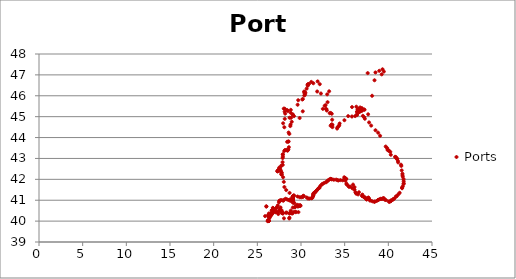
| Category | Ports |
|---|---|
| 26.031697 | 40.707 |
| 26.034148 | 40.698 |
| 26.775883 | 40.635 |
| 26.812547 | 40.62 |
| 26.826738 | 40.585 |
| 26.753546 | 40.552 |
| 26.687336 | 40.511 |
| 26.637445 | 40.509 |
| 26.328235 | 40.368 |
| 26.235822 | 40.294 |
| 25.889695 | 40.239 |
| 26.272296 | 40.213 |
| 26.211569 | 40.049 |
| 26.381764 | 40.152 |
| 26.365305 | 40.182 |
| 26.36253 | 40.2 |
| 26.430652 | 40.227 |
| 26.599782 | 40.327 |
| 26.632606 | 40.36 |
| 26.645759 | 40.399 |
| 26.688386 | 40.411 |
| 26.777734 | 40.48 |
| 26.901169 | 40.533 |
| 27.110716 | 40.604 |
| 27.18777 | 40.634 |
| 27.250049 | 40.666 |
| 27.338415 | 40.75 |
| 27.474058 | 40.902 |
| 27.518727 | 40.966 |
| 27.562311 | 40.978 |
| 27.640044 | 40.99 |
| 27.739357 | 41.008 |
| 27.970143 | 40.974 |
| 28.000019 | 41.016 |
| 28.230348 | 41.071 |
| 28.412015 | 41.039 |
| 28.579633 | 41.008 |
| 28.766643 | 40.975 |
| 28.736202 | 41.034 |
| 28.885613 | 40.974 |
| 28.9079133 | 40.983 |
| 28.958939 | 40.989 |
| 28.951804 | 41.006 |
| 28.964694 | 41.001 |
| 28.971333 | 41.001 |
| 28.974338 | 41 |
| 28.97943 | 41.018 |
| 28.974672 | 41.018 |
| 28.989457 | 41.027 |
| 28.999186 | 41.035 |
| 29.012492 | 41.04 |
| 29.023046 | 41.044 |
| 29.0259 | 41.046 |
| 29.037353 | 41.055 |
| 29.044552 | 41.064 |
| 29.045854 | 41.077 |
| 29.058124 | 41.087 |
| 29.056327 | 41.098 |
| 29.059717 | 41.111 |
| 29.060607 | 41.112 |
| 29.072046 | 41.121 |
| 29.066613 | 41.132 |
| 29.057643 | 41.138 |
| 29.038087 | 41.157 |
| 29.077336 | 41.183 |
| 29.081309 | 41.187 |
| 29.089103 | 41.195 |
| 29.100896 | 41.205 |
| 29.111432 | 41.213 |
| 28.692336 | 41.348 |
| 28.307975 | 41.487 |
| 28.0986 | 41.632 |
| 28.030661 | 41.878 |
| 27.951729 | 42.099 |
| 27.777205 | 42.225 |
| 27.780019 | 42.233 |
| 27.755799 | 42.263 |
| 27.792529 | 42.322 |
| 27.754538 | 42.328 |
| 27.692383 | 42.424 |
| 27.573028 | 42.449 |
| 27.533746 | 42.449 |
| 27.449732 | 42.415 |
| 27.322793 | 42.382 |
| 27.282161 | 42.388 |
| 27.335246 | 42.422 |
| 27.449466 | 42.474 |
| 27.493903 | 42.556 |
| 27.621543 | 42.554 |
| 27.735477 | 42.653 |
| 27.904284 | 42.689 |
| 27.890664 | 42.822 |
| 27.898019 | 43.019 |
| 27.925967 | 43.086 |
| 27.91971 | 43.178 |
| 27.920788 | 43.204 |
| 28.084006 | 43.354 |
| 28.164406 | 43.404 |
| 28.344595 | 43.406 |
| 28.45283 | 43.37 |
| 28.517872 | 43.413 |
| 28.550458 | 43.438 |
| 28.610005 | 43.538 |
| 28.535589 | 43.804 |
| 28.410275 | 43.797 |
| 28.583472 | 43.812 |
| 28.582393 | 44.24 |
| 28.09031 | 44.494 |
| 27.952134 | 44.682 |
| 28.139512 | 44.895 |
| 28.662766 | 44.172 |
| 28.775075 | 44.549 |
| 28.802835 | 44.623 |
| 28.941423 | 44.756 |
| 28.687121 | 44.948 |
| 28.861707 | 44.948 |
| 28.8148 | 45.186 |
| 28.491626 | 45.27 |
| 28.138792 | 45.379 |
| 28.025101 | 45.385 |
| 28.127894 | 45.239 |
| 28.186283 | 45.145 |
| 29.198041 | 45.025 |
| 29.0675 | 45.101 |
| 29.048 | 45.103 |
| 29.844811 | 44.935 |
| 28.831523 | 45.326 |
| 28.411852 | 45.32 |
| 30.203218 | 45.255 |
| 29.612769 | 45.57 |
| 29.682246 | 45.788 |
| 30.156114 | 45.822 |
| 30.201405 | 45.843 |
| 30.375449 | 46.013 |
| 30.467095 | 46.06 |
| 30.390811 | 46.138 |
| 30.348578 | 46.201 |
| 30.43704 | 46.184 |
| 30.501262 | 46.141 |
| 30.644508 | 46.341 |
| 30.769154 | 46.48 |
| 30.75644 | 46.538 |
| 30.802134 | 46.552 |
| 30.913587 | 46.567 |
| 31.179551 | 46.664 |
| 31.412078 | 46.599 |
| 31.904405 | 46.689 |
| 32.147822 | 46.556 |
| 31.852853 | 46.205 |
| 32.282864 | 46.108 |
| 32.997453 | 46.068 |
| 33.222635 | 46.213 |
| 33.042744 | 45.695 |
| 32.813667 | 45.553 |
| 32.714032 | 45.518 |
| 32.499556 | 45.372 |
| 32.863964 | 45.367 |
| 32.905978 | 45.362 |
| 32.957691 | 45.294 |
| 33.290377 | 45.164 |
| 33.388426 | 45.18 |
| 33.519253 | 45.139 |
| 33.567574 | 44.854 |
| 33.596857 | 44.61 |
| 33.531048 | 44.613 |
| 33.51877 | 44.622 |
| 33.487901 | 44.61 |
| 33.396512 | 44.563 |
| 33.598965 | 44.498 |
| 34.133977 | 44.431 |
| 34.175483 | 44.487 |
| 34.310787 | 44.544 |
| 34.37513 | 44.589 |
| 34.424744 | 44.674 |
| 34.971394 | 44.831 |
| 35.40311 | 45.027 |
| 35.832027 | 45.008 |
| 36.202315 | 45.028 |
| 36.428808 | 45.079 |
| 36.427795 | 45.133 |
| 36.417346 | 45.237 |
| 36.417027 | 45.238 |
| 36.48147 | 45.346 |
| 36.518247 | 45.349 |
| 36.619878 | 45.369 |
| 36.628 | 45.373 |
| 36.337184 | 45.477 |
| 35.843472 | 45.459 |
| 37.637411 | 47.087 |
| 38.526526 | 47.118 |
| 38.961722 | 47.195 |
| 39.335434 | 47.268 |
| 39.491058 | 47.16 |
| 39.239728 | 47.026 |
| 38.417705 | 46.743 |
| 38.139734 | 46 |
| 37.2783 | 45.334 |
| 37.211466 | 45.338 |
| 36.970666 | 45.408 |
| 36.769743 | 45.439 |
| 36.764766 | 45.357 |
| 36.85376 | 45.313 |
| 36.982623 | 45.295 |
| 36.945466 | 45.28 |
| 36.719189 | 45.227 |
| 36.614144 | 45.214 |
| 37.085413 | 45.04 |
| 37.239085 | 44.97 |
| 37.309645 | 44.901 |
| 37.687782 | 45.112 |
| 37.793801 | 44.723 |
| 38.034439 | 44.572 |
| 38.529342 | 44.349 |
| 38.830548 | 44.233 |
| 39.057199 | 44.086 |
| 39.699182 | 43.57 |
| 39.862905 | 43.501 |
| 39.907325 | 43.412 |
| 40.009349 | 43.38 |
| 40.081753 | 43.37 |
| 40.223249 | 43.315 |
| 40.283551 | 43.177 |
| 40.767469 | 43.078 |
| 40.860819 | 43.068 |
| 40.946654 | 42.996 |
| 41.01976 | 42.987 |
| 41.093344 | 42.885 |
| 41.121505 | 42.812 |
| 41.455723 | 42.698 |
| 41.484241 | 42.641 |
| 41.530916 | 42.427 |
| 41.617157 | 42.27 |
| 41.62486 | 42.196 |
| 41.653621 | 42.129 |
| 41.74261 | 42.011 |
| 41.75631 | 41.909 |
| 41.764068 | 41.811 |
| 41.74619 | 41.773 |
| 41.650231 | 41.656 |
| 41.565274 | 41.605 |
| 41.573741 | 41.573 |
| 41.294959 | 41.354 |
| 41.148443 | 41.283 |
| 40.971727 | 41.195 |
| 40.872667 | 41.185 |
| 40.709049 | 41.089 |
| 40.569334 | 41.049 |
| 40.534456 | 41.036 |
| 40.323847 | 40.991 |
| 40.305805 | 40.973 |
| 40.259139 | 40.948 |
| 40.112901 | 40.918 |
| 40.068253 | 40.942 |
| 39.739089 | 41.005 |
| 39.596558 | 41.022 |
| 39.509828 | 41.079 |
| 39.435566 | 41.105 |
| 39.336734 | 41.071 |
| 39.226905 | 41.061 |
| 39.135874 | 41.069 |
| 38.992223 | 41.045 |
| 38.846198 | 41.014 |
| 38.821436 | 41.008 |
| 38.654644 | 40.963 |
| 38.43706 | 40.929 |
| 38.390134 | 40.927 |
| 38.174747 | 40.947 |
| 37.932806 | 40.99 |
| 37.884258 | 40.991 |
| 37.789688 | 41.073 |
| 37.728723 | 41.117 |
| 37.701261 | 41.122 |
| 37.516071 | 41.031 |
| 37.48725 | 41.053 |
| 37.387574 | 41.109 |
| 37.332904 | 41.12 |
| 37.29641 | 41.137 |
| 37.228018 | 41.15 |
| 37.037293 | 41.189 |
| 36.976401 | 41.217 |
| 37.03072 | 41.27 |
| 36.636986 | 41.381 |
| 36.542199 | 41.28 |
| 36.339631 | 41.315 |
| 36.317182 | 41.329 |
| 36.228463 | 41.38 |
| 36.131482 | 41.502 |
| 36.122683 | 41.629 |
| 35.959063 | 41.748 |
| 35.882748 | 41.57 |
| 35.659999 | 41.648 |
| 35.501672 | 41.639 |
| 35.415002 | 41.687 |
| 35.238398 | 41.753 |
| 35.201452 | 41.792 |
| 35.090278 | 41.929 |
| 35.14885 | 42.021 |
| 35.178924 | 42.026 |
| 35.074574 | 42.032 |
| 35.05828 | 42.05 |
| 35.04221 | 42.06 |
| 34.955292 | 42.098 |
| 34.772607 | 41.953 |
| 34.510945 | 41.962 |
| 34.279437 | 41.945 |
| 34.167921 | 41.964 |
| 34.032162 | 41.985 |
| 33.758788 | 41.981 |
| 33.530921 | 42 |
| 33.466118 | 42.01 |
| 33.396323 | 42.017 |
| 33.362693 | 42.021 |
| 33.203928 | 41.978 |
| 33.074305 | 41.941 |
| 32.984664 | 41.901 |
| 32.858033 | 41.859 |
| 32.66982 | 41.831 |
| 32.481548 | 41.784 |
| 32.386015 | 41.755 |
| 32.215629 | 41.687 |
| 32.127892 | 41.601 |
| 32.045434 | 41.584 |
| 32.0247 | 41.572 |
| 31.95374 | 41.538 |
| 31.827473 | 41.489 |
| 31.78667 | 41.459 |
| 31.68226 | 41.412 |
| 31.604219 | 41.379 |
| 31.588112 | 41.375 |
| 31.542509 | 41.365 |
| 31.464391 | 41.331 |
| 31.417137 | 41.317 |
| 31.406567 | 41.285 |
| 31.391451 | 41.245 |
| 31.406413 | 41.217 |
| 31.375819 | 41.182 |
| 31.300354 | 41.119 |
| 31.23376 | 41.103 |
| 31.199289 | 41.098 |
| 30.967863 | 41.079 |
| 30.80211 | 41.086 |
| 30.649346 | 41.131 |
| 30.320853 | 41.199 |
| 30.260447 | 41.214 |
| 30.224412 | 41.17 |
| 30.194158 | 41.156 |
| 30.019743 | 41.141 |
| 29.847963 | 41.144 |
| 29.60646 | 41.178 |
| 29.210147 | 41.227 |
| 29.157334 | 41.22 |
| 29.119694 | 41.202 |
| 29.111677 | 41.185 |
| 29.08635 | 41.175 |
| 29.072073 | 41.164 |
| 29.075837 | 41.153 |
| 29.076805 | 41.138 |
| 29.08705 | 41.135 |
| 29.095077 | 41.124 |
| 29.080276 | 41.109 |
| 29.065214 | 41.094 |
| 29.06502 | 41.087 |
| 29.065026 | 41.082 |
| 29.063017 | 41.078 |
| 29.058339 | 41.075 |
| 29.055235 | 41.068 |
| 29.051703 | 41.058 |
| 29.051118 | 41.049 |
| 29.013073 | 41.03 |
| 29.019416 | 40.993 |
| 29.032451 | 40.977 |
| 29.037228 | 40.966 |
| 29.066719 | 40.959 |
| 29.090085 | 40.948 |
| 29.072914 | 40.882 |
| 29.141067 | 40.896 |
| 29.233356 | 40.867 |
| 29.496275 | 40.765 |
| 29.616011 | 40.777 |
| 29.790969 | 40.74 |
| 29.878164 | 40.753 |
| 29.922895 | 40.755 |
| 29.929593 | 40.727 |
| 29.817078 | 40.731 |
| 29.715614 | 40.715 |
| 29.628146 | 40.699 |
| 29.516502 | 40.716 |
| 29.334511 | 40.677 |
| 29.277631 | 40.666 |
| 29.064442 | 40.65 |
| 28.829686 | 40.503 |
| 29.144694 | 40.43 |
| 29.344186 | 40.452 |
| 29.702657 | 40.43 |
| 29.413277 | 40.427 |
| 29.022281 | 40.364 |
| 28.893219 | 40.373 |
| 28.799347 | 40.394 |
| 28.724505 | 40.379 |
| 28.668347 | 40.368 |
| 28.675363 | 40.164 |
| 28.649587 | 40.128 |
| 28.375894 | 40.404 |
| 28.2742 | 40.403 |
| 28.050389 | 40.132 |
| 27.93492 | 40.366 |
| 27.893588 | 40.383 |
| 27.874753 | 40.376 |
| 27.788782 | 40.395 |
| 27.784669 | 40.514 |
| 27.920051 | 40.406 |
| 27.603401 | 40.487 |
| 27.506947 | 40.501 |
| 27.557503 | 40.582 |
| 27.659173 | 40.653 |
| 27.404111 | 40.339 |
| 27.318165 | 40.413 |
| 27.20419 | 40.436 |
| 27.149023 | 40.455 |
| 27.063578 | 40.422 |
| 26.779828 | 40.408 |
| 26.719849 | 40.385 |
| 26.686202 | 40.353 |
| 26.587016 | 40.276 |
| 26.405553 | 40.191 |
| 26.334269 | 40.035 |
| 26.330153 | 40.013 |
| 26.318075 | 40.005 |
| 26.298813 | 40.016 |
| 26.279458 | 40.006 |
| 26.263517 | 40.003 |
| 26.179752 | 39.998 |